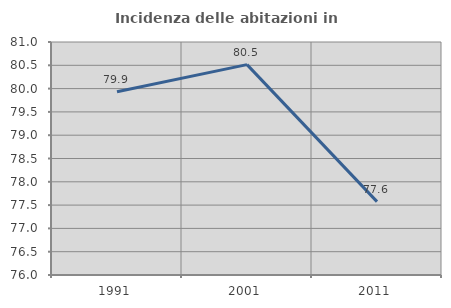
| Category | Incidenza delle abitazioni in proprietà  |
|---|---|
| 1991.0 | 79.932 |
| 2001.0 | 80.515 |
| 2011.0 | 77.574 |